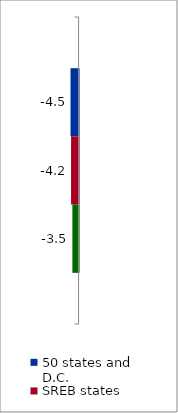
| Category | 50 states and D.C. | SREB states | State |
|---|---|---|---|
| 2011 to 2016 | -4.546 | -4.237 | -3.493 |